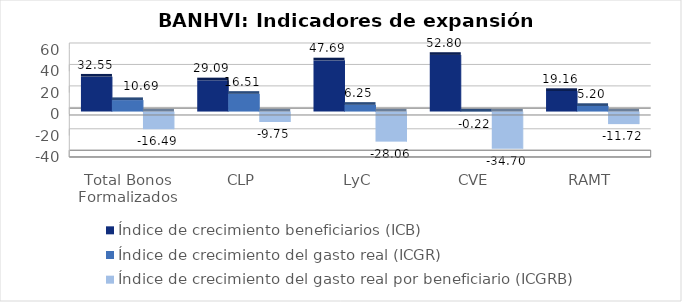
| Category | Índice de crecimiento beneficiarios (ICB)  | Índice de crecimiento del gasto real (ICGR)  | Índice de crecimiento del gasto real por beneficiario (ICGRB)  |
|---|---|---|---|
| Total Bonos Formalizados | 32.547 | 10.686 | -16.493 |
| CLP | 29.095 | 16.507 | -9.751 |
| LyC | 47.695 | 6.253 | -28.059 |
| CVE | 52.804 | -0.217 | -34.699 |
| RAMT | 19.164 | 5.203 | -11.716 |